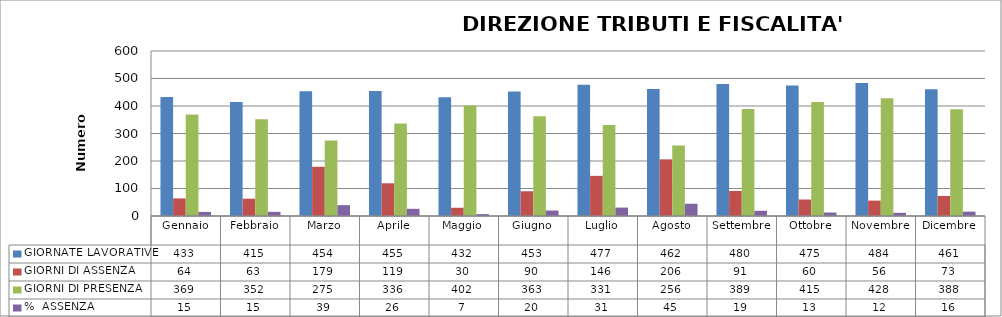
| Category | GIORNATE LAVORATIVE | GIORNI DI ASSENZA | GIORNI DI PRESENZA | %  ASSENZA |
|---|---|---|---|---|
| Gennaio | 433 | 64 | 369 | 14.781 |
| Febbraio | 415 | 63 | 352 | 15.181 |
| Marzo | 454 | 179 | 275 | 39.427 |
| Aprile | 455 | 119 | 336 | 26.154 |
| Maggio | 432 | 30 | 402 | 6.944 |
| Giugno | 453 | 90 | 363 | 19.868 |
| Luglio | 477 | 146 | 331 | 30.608 |
| Agosto | 462 | 206 | 256 | 44.589 |
| Settembre | 480 | 91 | 389 | 18.958 |
| Ottobre | 475 | 60 | 415 | 12.632 |
| Novembre | 484 | 56 | 428 | 11.57 |
| Dicembre | 461 | 73 | 388 | 15.835 |